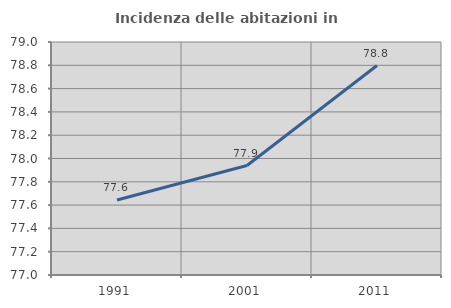
| Category | Incidenza delle abitazioni in proprietà  |
|---|---|
| 1991.0 | 77.644 |
| 2001.0 | 77.939 |
| 2011.0 | 78.798 |